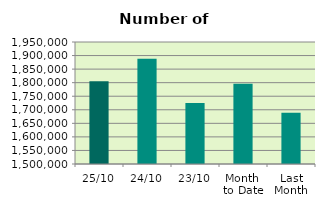
| Category | Series 0 |
|---|---|
| 25/10 | 1805176 |
| 24/10 | 1887910 |
| 23/10 | 1724886 |
| Month 
to Date | 1796186.421 |
| Last
Month | 1689477.048 |